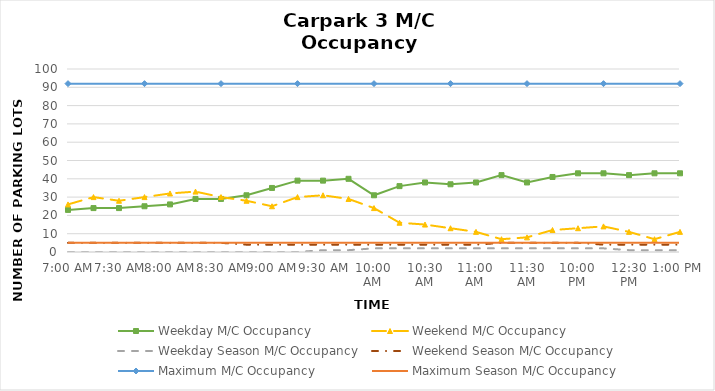
| Category | Weekday M/C Occupancy | Weekend M/C Occupancy | Weekday Season M/C Occupancy | Weekend Season M/C Occupancy | Maximum M/C Occupancy | Maximum Season M/C Occupancy |
|---|---|---|---|---|---|---|
| 0.291666666666666 | 23 | 26 | 0 | 5 | 92 | 5 |
| 0.302083333333333 | 24 | 30 | 0 | 5 | 92 | 5 |
| 0.3125 | 24 | 28 | 0 | 5 | 92 | 5 |
| 0.322916666666667 | 25 | 30 | 0 | 5 | 92 | 5 |
| 0.333333333333333 | 26 | 32 | 0 | 5 | 92 | 5 |
| 0.34375 | 29 | 33 | 0 | 5 | 92 | 5 |
| 0.354166666666667 | 29 | 30 | 0 | 5 | 92 | 5 |
| 0.364583333333333 | 31 | 28 | 0 | 4 | 92 | 5 |
| 0.375 | 35 | 25 | 0 | 4 | 92 | 5 |
| 0.385416666666667 | 39 | 30 | 0 | 4 | 92 | 5 |
| 0.395833333333333 | 39 | 31 | 1 | 4 | 92 | 5 |
| 0.40625 | 40 | 29 | 1 | 4 | 92 | 5 |
| 0.416666666666667 | 31 | 24 | 2 | 4 | 92 | 5 |
| 0.427083333333333 | 36 | 16 | 2 | 4 | 92 | 5 |
| 0.4375 | 38 | 15 | 2 | 4 | 92 | 5 |
| 0.447916666666667 | 37 | 13 | 2 | 4 | 92 | 5 |
| 0.458333333333333 | 38 | 11 | 2 | 4 | 92 | 5 |
| 0.46875 | 42 | 7 | 2 | 5 | 92 | 5 |
| 0.479166666666667 | 38 | 8 | 2 | 5 | 92 | 5 |
| 0.489583333333333 | 41 | 12 | 2 | 5 | 92 | 5 |
| 0.5 | 43 | 13 | 2 | 5 | 92 | 5 |
| 0.510416666666667 | 43 | 14 | 2 | 4 | 92 | 5 |
| 0.520833333333333 | 42 | 11 | 1 | 4 | 92 | 5 |
| 0.53125 | 43 | 7 | 1 | 4 | 92 | 5 |
| 0.541666666666667 | 43 | 11 | 1 | 4 | 92 | 5 |